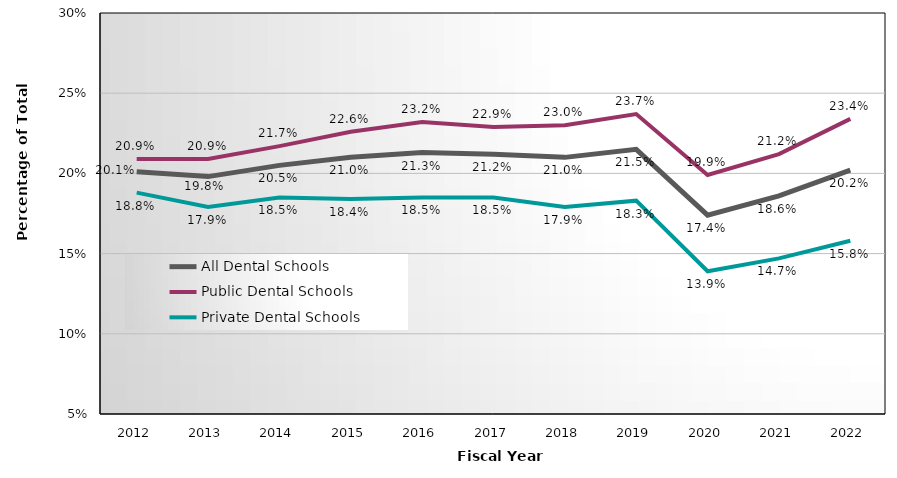
| Category | All Dental Schools | Public Dental Schools | Private Dental Schools |
|---|---|---|---|
| 2012.0 | 0.201 | 0.209 | 0.188 |
| 2013.0 | 0.198 | 0.209 | 0.179 |
| 2014.0 | 0.205 | 0.217 | 0.185 |
| 2015.0 | 0.21 | 0.226 | 0.184 |
| 2016.0 | 0.213 | 0.232 | 0.185 |
| 2017.0 | 0.212 | 0.229 | 0.185 |
| 2018.0 | 0.21 | 0.23 | 0.179 |
| 2019.0 | 0.215 | 0.237 | 0.183 |
| 2020.0 | 0.174 | 0.199 | 0.139 |
| 2021.0 | 0.186 | 0.212 | 0.147 |
| 2022.0 | 0.202 | 0.234 | 0.158 |